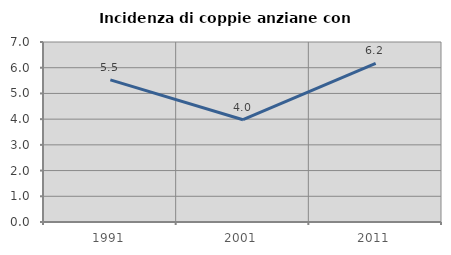
| Category | Incidenza di coppie anziane con figli |
|---|---|
| 1991.0 | 5.525 |
| 2001.0 | 3.977 |
| 2011.0 | 6.173 |